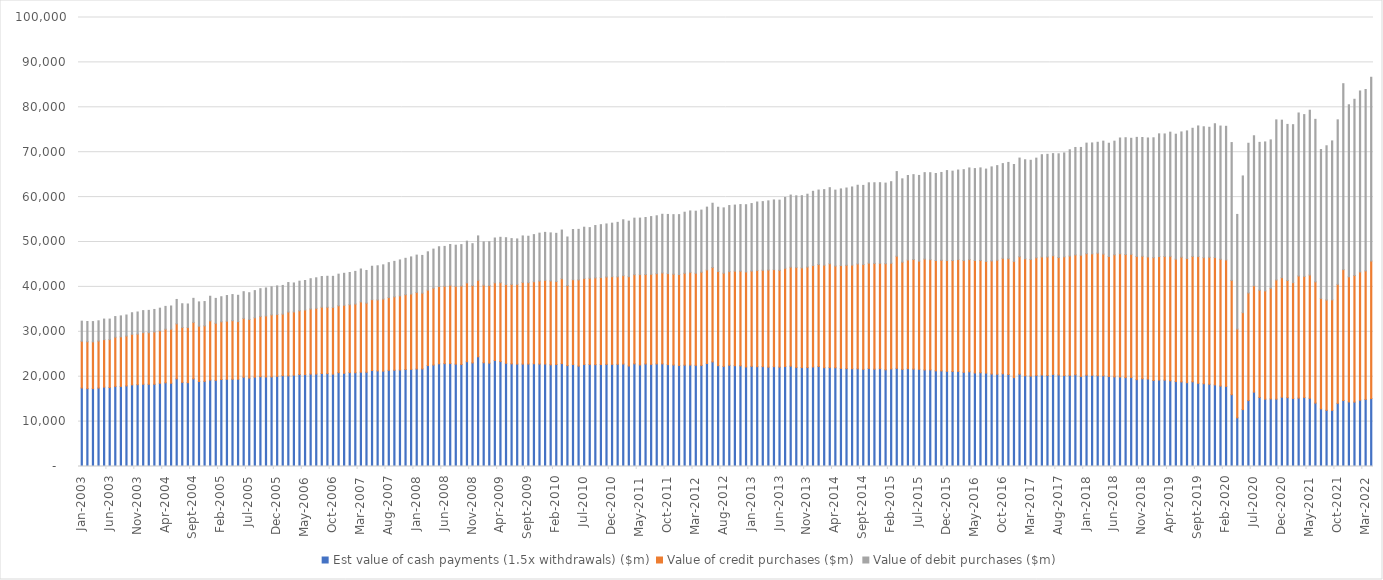
| Category | Est value of cash payments (1.5x withdrawals) ($m) | Value of credit purchases ($m) | Value of debit purchases ($m) |
|---|---|---|---|
| 2003-01-31 | 17486.893 | 10410.011 | 4472.007 |
| 2003-02-28 | 17337.236 | 10445.788 | 4513.496 |
| 2003-03-31 | 17344.548 | 10412.955 | 4520.743 |
| 2003-04-30 | 17471.468 | 10465.525 | 4511.707 |
| 2003-05-31 | 17678.366 | 10584.215 | 4571.41 |
| 2003-06-30 | 17585.238 | 10676.978 | 4572.292 |
| 2003-07-31 | 17845.113 | 10949.574 | 4600.961 |
| 2003-08-31 | 17834.11 | 11053.104 | 4650.417 |
| 2003-09-30 | 17944.304 | 11104.611 | 4690.598 |
| 2003-10-31 | 18185.603 | 11261.17 | 4799.417 |
| 2003-11-30 | 18217.56 | 11269.676 | 4925.265 |
| 2003-12-31 | 18318.52 | 11476.461 | 4923.863 |
| 2004-01-31 | 18310.266 | 11483.474 | 4979.882 |
| 2004-02-29 | 18312.968 | 11634.606 | 5028.838 |
| 2004-03-31 | 18540.124 | 11708.991 | 5016.264 |
| 2004-04-30 | 18635.465 | 11945.392 | 5077.828 |
| 2004-05-31 | 18544.259 | 12045.411 | 5159.251 |
| 2004-06-30 | 19521.131 | 12247.091 | 5435.017 |
| 2004-07-31 | 18734.749 | 12220.798 | 5293.073 |
| 2004-08-31 | 18668.58 | 12301.468 | 5225.597 |
| 2004-09-30 | 19518.03 | 12574.365 | 5360.175 |
| 2004-10-31 | 18936.727 | 12316.721 | 5407.855 |
| 2004-11-30 | 18959.572 | 12364.381 | 5414.631 |
| 2004-12-31 | 19266.983 | 13168.89 | 5482.037 |
| 2005-01-31 | 19193.427 | 12697.712 | 5547.327 |
| 2005-02-28 | 19373.209 | 12848.259 | 5586.813 |
| 2005-03-31 | 19428.471 | 12940.825 | 5706.765 |
| 2005-04-30 | 19438.091 | 13030.438 | 5822.429 |
| 2005-05-31 | 19437.891 | 12839.343 | 5850.777 |
| 2005-06-30 | 19873.813 | 13110.232 | 5947.876 |
| 2005-07-31 | 19694.177 | 13053.213 | 5954.398 |
| 2005-08-31 | 19889.052 | 13233.092 | 6050.81 |
| 2005-09-30 | 19993.371 | 13435.976 | 6170.815 |
| 2005-10-31 | 19931.282 | 13603.53 | 6232.379 |
| 2005-11-30 | 19950.25 | 13814.813 | 6258.867 |
| 2005-12-31 | 20087.138 | 13781.845 | 6346.953 |
| 2006-01-31 | 20237.497 | 13703.282 | 6385.684 |
| 2006-02-28 | 20195.314 | 14215.496 | 6560.046 |
| 2006-03-31 | 20345.17 | 14080.773 | 6450.755 |
| 2006-04-30 | 20490.427 | 14186.663 | 6597.455 |
| 2006-05-31 | 20470.811 | 14396.693 | 6564.528 |
| 2006-06-30 | 20581.538 | 14506.917 | 6733.639 |
| 2006-07-31 | 20592.602 | 14639.089 | 6794.423 |
| 2006-08-31 | 20712.785 | 14763.943 | 6831.863 |
| 2006-09-30 | 20682.593 | 14789.448 | 6892.448 |
| 2006-10-31 | 20573.18 | 14862.305 | 6918.145 |
| 2006-11-30 | 20890.423 | 14902.711 | 7041.893 |
| 2006-12-31 | 20760.733 | 15158.346 | 7109.753 |
| 2007-01-31 | 20914.763 | 15124.017 | 7171.65 |
| 2007-02-28 | 20875.495 | 15313.489 | 7267.695 |
| 2007-03-31 | 21012.312 | 15642.048 | 7330.065 |
| 2007-04-30 | 20989.426 | 15404.139 | 7267.599 |
| 2007-05-31 | 21384.736 | 15777.591 | 7437.769 |
| 2007-06-30 | 21289.961 | 15814.294 | 7597.579 |
| 2007-07-31 | 21232.529 | 16069.056 | 7610.279 |
| 2007-08-31 | 21415.876 | 16204.996 | 7779.065 |
| 2007-09-30 | 21450.403 | 16332.381 | 7904.35 |
| 2007-10-31 | 21509.93 | 16494.458 | 8000.368 |
| 2007-11-30 | 21606.444 | 16656.128 | 8103.432 |
| 2007-12-31 | 21638.936 | 16777.433 | 8262.021 |
| 2008-01-31 | 21719.423 | 17052.797 | 8307.43 |
| 2008-02-29 | 21738.419 | 16874.418 | 8397.17 |
| 2008-03-31 | 22482.932 | 16803.269 | 8528.993 |
| 2008-04-30 | 22599.294 | 17133.453 | 8682.424 |
| 2008-05-31 | 22869.638 | 17239.646 | 8833.511 |
| 2008-06-30 | 22907.666 | 17239.233 | 8869.304 |
| 2008-07-31 | 22935.402 | 17432.647 | 9073.441 |
| 2008-08-31 | 22805.536 | 17349.327 | 9130.087 |
| 2008-09-30 | 22727.345 | 17491.134 | 9200.315 |
| 2008-10-31 | 23336.618 | 17561.066 | 9286.774 |
| 2008-11-30 | 23076.514 | 17215.6 | 9335.216 |
| 2008-12-31 | 24435.388 | 17045.732 | 9875.285 |
| 2009-01-31 | 23107.172 | 17286.309 | 9625.404 |
| 2009-02-28 | 23015.315 | 17295.075 | 9752.943 |
| 2009-03-31 | 23620.073 | 17288.997 | 9979.282 |
| 2009-04-30 | 23369.396 | 17567.228 | 10111.011 |
| 2009-05-31 | 22983.726 | 17546.281 | 10425.256 |
| 2009-06-30 | 22861.039 | 17709.415 | 10184.536 |
| 2009-07-31 | 22810.829 | 17759.214 | 10111.07 |
| 2009-08-31 | 22809.334 | 18186.451 | 10354.612 |
| 2009-09-30 | 22818.657 | 18116.497 | 10347.728 |
| 2009-10-31 | 22878.493 | 18270.072 | 10495.103 |
| 2009-11-30 | 22811.868 | 18494.032 | 10667.008 |
| 2009-12-31 | 22818.633 | 18655.706 | 10667.339 |
| 2010-01-31 | 22650.613 | 18666.11 | 10713.135 |
| 2010-02-28 | 22716.143 | 18469.904 | 10740.888 |
| 2010-03-31 | 22914.183 | 18907.191 | 10841.81 |
| 2010-04-30 | 22470.357 | 17842.659 | 10802.141 |
| 2010-05-31 | 22711.37 | 18893.37 | 11171.089 |
| 2010-06-30 | 22362.197 | 19201.128 | 11248.391 |
| 2010-07-31 | 22731.679 | 19160.93 | 11401.793 |
| 2010-08-31 | 22727.027 | 19205.631 | 11269.075 |
| 2010-09-30 | 22685.561 | 19325.389 | 11656.652 |
| 2010-10-31 | 22721.742 | 19364.182 | 11773.172 |
| 2010-11-30 | 22749.19 | 19458.704 | 11811.424 |
| 2010-12-31 | 22752.499 | 19519.753 | 11923.366 |
| 2011-01-31 | 22760.138 | 19487.495 | 12127.159 |
| 2011-02-28 | 22823.267 | 19681.027 | 12443.64 |
| 2011-03-31 | 22387.644 | 19887.488 | 12363.848 |
| 2011-04-30 | 22859.901 | 19859.116 | 12590.366 |
| 2011-05-31 | 22624.066 | 20119.315 | 12582.843 |
| 2011-06-30 | 22836.24 | 19924.926 | 12689.938 |
| 2011-07-31 | 22745.045 | 20062.331 | 12850.878 |
| 2011-08-31 | 22847.702 | 20093.071 | 12899.152 |
| 2011-09-30 | 22857.02 | 20244.899 | 13071.934 |
| 2011-10-31 | 22687.925 | 20278.294 | 13171.204 |
| 2011-11-30 | 22607.319 | 20223.144 | 13261.16 |
| 2011-12-31 | 22508.911 | 20252.681 | 13335.226 |
| 2012-01-31 | 22574.431 | 20457.547 | 13602.292 |
| 2012-02-29 | 22597.474 | 20648.024 | 13672.636 |
| 2012-03-31 | 22539.342 | 20497.173 | 13823.937 |
| 2012-04-30 | 22520.553 | 20755.108 | 13827.313 |
| 2012-05-31 | 22937.777 | 20845.265 | 13983.796 |
| 2012-06-30 | 23298.143 | 21011.008 | 14322.366 |
| 2012-07-31 | 22457.389 | 20981.985 | 14304.84 |
| 2012-08-31 | 22292.815 | 20759.218 | 14548.112 |
| 2012-09-30 | 22542.223 | 20850.813 | 14723.179 |
| 2012-10-31 | 22457.442 | 21048.448 | 14715.843 |
| 2012-11-30 | 22430.168 | 21070.38 | 14834.807 |
| 2012-12-31 | 22167.787 | 21166.611 | 14969.617 |
| 2013-01-31 | 22313.217 | 21206.942 | 15042.54 |
| 2013-02-28 | 22230.649 | 21442.597 | 15230.735 |
| 2013-03-31 | 22244.049 | 21466.58 | 15281.413 |
| 2013-04-30 | 22122.76 | 21641.49 | 15398.137 |
| 2013-05-31 | 22237.078 | 21616.493 | 15509.779 |
| 2013-06-30 | 22138.19 | 21559.996 | 15622.56 |
| 2013-07-31 | 22281.55 | 21866.709 | 15772.269 |
| 2013-08-31 | 22353.574 | 22033.846 | 16065.551 |
| 2013-09-30 | 22067.528 | 22273.762 | 15942.668 |
| 2013-10-31 | 22027.772 | 22211.131 | 16071.551 |
| 2013-11-30 | 22028.291 | 22399.026 | 16213.731 |
| 2013-12-31 | 22165.62 | 22598.4 | 16523.682 |
| 2014-01-31 | 22265.346 | 22722.76 | 16579.901 |
| 2014-02-28 | 22010.578 | 22840.597 | 16819.02 |
| 2014-03-31 | 22022.854 | 23137.519 | 16936.352 |
| 2014-04-30 | 21997.15 | 22649.308 | 16905.288 |
| 2014-05-31 | 21856.493 | 22913.46 | 17052.166 |
| 2014-06-30 | 21792.478 | 23027.014 | 17203.804 |
| 2014-07-31 | 21769.86 | 23084.275 | 17401.114 |
| 2014-08-31 | 21758.733 | 23356.052 | 17525.466 |
| 2014-09-30 | 21642.321 | 23345.345 | 17615.69 |
| 2014-10-31 | 21839.39 | 23455.552 | 17884.66 |
| 2014-11-30 | 21677.67 | 23549.241 | 17968.345 |
| 2014-12-31 | 21796.645 | 23470.73 | 17943.506 |
| 2015-01-31 | 21540.365 | 23633.481 | 17943.775 |
| 2015-02-28 | 21734.054 | 23541.956 | 18156.825 |
| 2015-03-31 | 21857.635 | 24974.85 | 18852.708 |
| 2015-04-30 | 21635.098 | 23875.139 | 18554.396 |
| 2015-05-31 | 21790.383 | 24205.972 | 18813.882 |
| 2015-06-30 | 21699.53 | 24405.065 | 18896.953 |
| 2015-07-31 | 21650.546 | 24090.127 | 19080.862 |
| 2015-08-31 | 21511.741 | 24692.833 | 19241.322 |
| 2015-09-30 | 21525.318 | 24537.979 | 19371.081 |
| 2015-10-31 | 21300.188 | 24572.861 | 19382.242 |
| 2015-11-30 | 21287.189 | 24646.674 | 19554.951 |
| 2015-12-31 | 21197.096 | 24683.576 | 20029.464 |
| 2016-01-31 | 21172.465 | 24715.55 | 19887.868 |
| 2016-02-29 | 21178.503 | 24908.338 | 19938.607 |
| 2016-03-31 | 20982.46 | 24879.489 | 20251.742 |
| 2016-04-30 | 21096.226 | 24989.907 | 20406.872 |
| 2016-05-31 | 20827.885 | 25061.044 | 20464.388 |
| 2016-06-30 | 20879.363 | 25015.833 | 20607.837 |
| 2016-07-31 | 20802.302 | 24882.864 | 20554.065 |
| 2016-08-31 | 20600.709 | 25181.992 | 20941.924 |
| 2016-09-30 | 20548.74 | 25397.562 | 21064.541 |
| 2016-10-31 | 20646.851 | 25717.664 | 21096.38 |
| 2016-11-30 | 20488.047 | 25784.648 | 21450.607 |
| 2016-12-31 | 19800.444 | 25875.162 | 21587.872 |
| 2017-01-31 | 20558.466 | 26159.786 | 21973.56 |
| 2017-02-28 | 20227.654 | 26047.182 | 22040.693 |
| 2017-03-31 | 20143.281 | 25966.662 | 22086.501 |
| 2017-04-30 | 20290.254 | 26205.784 | 22181.117 |
| 2017-05-31 | 20378.084 | 26290.417 | 22772.966 |
| 2017-06-30 | 20278.818 | 26389.717 | 22854.857 |
| 2017-07-31 | 20508.404 | 26428.361 | 22747.019 |
| 2017-08-31 | 20379.968 | 26158.857 | 23102.296 |
| 2017-09-30 | 20259.094 | 26437.713 | 23134.471 |
| 2017-10-31 | 20313.544 | 26564.001 | 23663.523 |
| 2017-11-30 | 20429.071 | 26698.027 | 23926.693 |
| 2017-12-31 | 20069.609 | 26990.849 | 23997.387 |
| 2018-01-31 | 20339.608 | 27053.736 | 24626.487 |
| 2018-02-28 | 20319.425 | 27045.797 | 24698.629 |
| 2018-03-31 | 20219.987 | 27292.422 | 24699.886 |
| 2018-04-30 | 20210.597 | 27099.252 | 25152.751 |
| 2018-05-31 | 20060.313 | 26720.973 | 25215.099 |
| 2018-06-30 | 19955.09 | 27196.674 | 25304.61 |
| 2018-07-31 | 19930.754 | 27451.43 | 25782.387 |
| 2018-08-31 | 19805.705 | 27412.138 | 26007.423 |
| 2018-09-30 | 19810.943 | 27446.231 | 25837.855 |
| 2018-10-31 | 19348.687 | 27420.133 | 26531.296 |
| 2018-11-30 | 19546.765 | 27277.632 | 26453.581 |
| 2018-12-31 | 19473.272 | 27203.386 | 26492.386 |
| 2019-01-31 | 19162.897 | 27356.245 | 26692.723 |
| 2019-02-28 | 19262.996 | 27495.791 | 27327.621 |
| 2019-03-31 | 19241.778 | 27528.87 | 27295.841 |
| 2019-04-30 | 19090.345 | 27716.272 | 27653.126 |
| 2019-05-31 | 18917.653 | 27268.428 | 27820.625 |
| 2019-06-30 | 18838.56 | 27779.325 | 27895.629 |
| 2019-07-31 | 18665.897 | 27667.019 | 28409.412 |
| 2019-08-31 | 18865.294 | 27921.427 | 28540.948 |
| 2019-09-30 | 18521.025 | 28232.392 | 29090.939 |
| 2019-10-31 | 18425.765 | 28089.791 | 29147.661 |
| 2019-11-30 | 18310.383 | 28297.839 | 28941.722 |
| 2019-12-31 | 18176.19 | 28378.299 | 29782.178 |
| 2020-01-31 | 17918.22 | 28238.429 | 29666.956 |
| 2020-02-29 | 17845.785 | 28171.722 | 29751.446 |
| 2020-03-31 | 15994.813 | 25446.328 | 30705.227 |
| 2020-04-30 | 10835.581 | 19777.532 | 25529.209 |
| 2020-05-31 | 12674.495 | 21580.268 | 30457.729 |
| 2020-06-30 | 14683.433 | 23966.801 | 33341.409 |
| 2020-07-31 | 16558.662 | 23699.594 | 33400.96 |
| 2020-08-31 | 15383.876 | 23895.962 | 32908.914 |
| 2020-09-30 | 14995.043 | 24115.701 | 33172.949 |
| 2020-10-31 | 15056.04 | 24647.766 | 33037.691 |
| 2020-11-30 | 15012.189 | 26537.443 | 35648.55 |
| 2020-12-31 | 15436.218 | 26612.618 | 35085.316 |
| 2021-01-31 | 15324.328 | 26099.334 | 34763.47 |
| 2021-02-28 | 15141.245 | 25800.063 | 35189.213 |
| 2021-03-31 | 15232.639 | 27199.103 | 36300.785 |
| 2021-04-30 | 15361.733 | 26975.091 | 36033.994 |
| 2021-05-31 | 15184.401 | 27462.632 | 36700.515 |
| 2021-06-30 | 14121.099 | 27002.587 | 36192.524 |
| 2021-07-31 | 12837.93 | 24605.096 | 33154.211 |
| 2021-08-31 | 12506.636 | 24580.702 | 34342.948 |
| 2021-09-30 | 12503.132 | 24620.331 | 35389.676 |
| 2021-10-31 | 14063.011 | 26502.048 | 36643.932 |
| 2021-11-30 | 14702.527 | 29140.518 | 41412.855 |
| 2021-12-31 | 14382.962 | 27865.452 | 38313.284 |
| 2022-01-31 | 14340.006 | 28213.725 | 39231.724 |
| 2022-02-28 | 14772.919 | 28552.191 | 40309.707 |
| 2022-03-31 | 14937.118 | 28618.887 | 40410.674 |
| 2022-04-30 | 15123.416 | 30633.56 | 40930.269 |